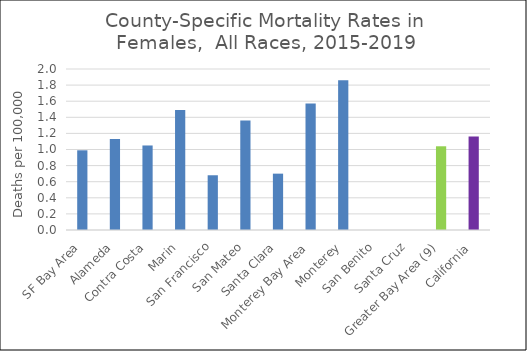
| Category | Female |
|---|---|
| SF Bay Area | 0.99 |
|   Alameda | 1.13 |
|   Contra Costa | 1.05 |
|   Marin | 1.49 |
|   San Francisco | 0.68 |
|   San Mateo | 1.36 |
|   Santa Clara | 0.7 |
| Monterey Bay Area | 1.57 |
|   Monterey | 1.86 |
|   San Benito | 0 |
|   Santa Cruz | 0 |
| Greater Bay Area (9) | 1.04 |
| California | 1.16 |